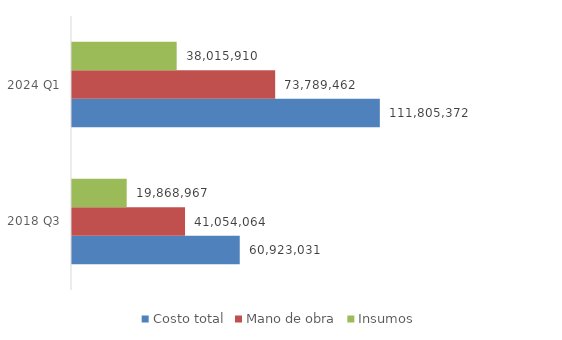
| Category | Costo total | Mano de obra | Insumos |
|---|---|---|---|
| 2018 Q3 | 60923031.371 | 41054064.171 | 19868967.2 |
| 2024 Q1 | 111805371.599 | 73789461.968 | 38015909.631 |